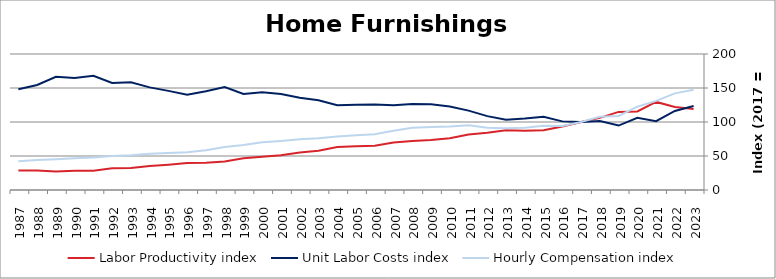
| Category | Labor Productivity index | Unit Labor Costs index | Hourly Compensation index |
|---|---|---|---|
| 2023.0 | 119.281 | 123.577 | 147.403 |
| 2022.0 | 122.201 | 116.262 | 142.073 |
| 2021.0 | 129.507 | 101.143 | 130.987 |
| 2020.0 | 115.52 | 106.061 | 122.521 |
| 2019.0 | 114.851 | 94.751 | 108.822 |
| 2018.0 | 106.07 | 101.443 | 107.601 |
| 2017.0 | 100 | 100 | 100 |
| 2016.0 | 93.264 | 100.918 | 94.119 |
| 2015.0 | 87.879 | 107.691 | 94.638 |
| 2014.0 | 87.283 | 104.974 | 91.624 |
| 2013.0 | 88.012 | 103.327 | 90.94 |
| 2012.0 | 84.178 | 108.617 | 91.432 |
| 2011.0 | 81.632 | 116.758 | 95.311 |
| 2010.0 | 76.157 | 122.815 | 93.533 |
| 2009.0 | 73.454 | 126.002 | 92.553 |
| 2008.0 | 72.213 | 126.548 | 91.384 |
| 2007.0 | 69.983 | 124.558 | 87.169 |
| 2006.0 | 65.106 | 125.772 | 81.884 |
| 2005.0 | 64.28 | 125.466 | 80.65 |
| 2004.0 | 63.095 | 124.698 | 78.678 |
| 2003.0 | 57.686 | 131.945 | 76.114 |
| 2002.0 | 55.032 | 135.538 | 74.589 |
| 2001.0 | 51.121 | 141.163 | 72.164 |
| 2000.0 | 48.833 | 143.686 | 70.166 |
| 1999.0 | 46.749 | 141.318 | 66.065 |
| 1998.0 | 41.81 | 151.353 | 63.28 |
| 1997.0 | 40.142 | 145.263 | 58.311 |
| 1996.0 | 39.628 | 140.125 | 55.529 |
| 1995.0 | 37.257 | 145.79 | 54.317 |
| 1994.0 | 35.316 | 150.917 | 53.299 |
| 1993.0 | 32.356 | 158.498 | 51.283 |
| 1992.0 | 31.822 | 157.389 | 50.085 |
| 1991.0 | 28.33 | 168.095 | 47.621 |
| 1990.0 | 28.335 | 164.598 | 46.64 |
| 1989.0 | 27.244 | 166.599 | 45.389 |
| 1988.0 | 28.555 | 154.438 | 44.099 |
| 1987.0 | 28.534 | 148.254 | 42.302 |